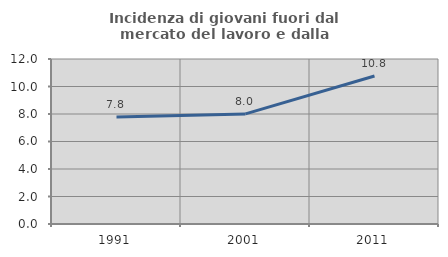
| Category | Incidenza di giovani fuori dal mercato del lavoro e dalla formazione  |
|---|---|
| 1991.0 | 7.778 |
| 2001.0 | 8.008 |
| 2011.0 | 10.767 |